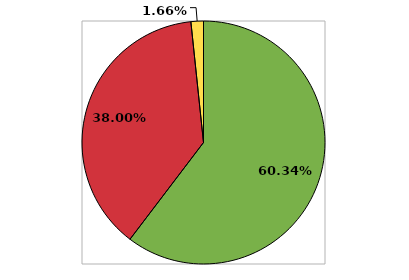
| Category | Series 0 |
|---|---|
| 0 | 0.603 |
| 1 | 0.38 |
| 2 | 0.017 |